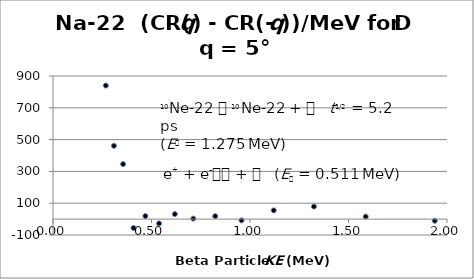
| Category | Series 0 |
|---|---|
| 0.2680227366322104 | 839.871 |
| 0.309304754344384 | 460.938 |
| 0.35590877077319627 | 345.836 |
| 0.4087613453094022 | -55.675 |
| 0.4690432505833301 | 18.925 |
| 0.5382797505768625 | -27.31 |
| 0.6184725682258746 | 31.31 |
| 0.7122978664250175 | 3.22 |
| 0.8234122552039224 | 18.587 |
| 0.9569424467790375 | -7.947 |
| 1.1203013982320613 | 54.708 |
| 1.3246166201445688 | 78.832 |
| 1.5873828179673266 | 15.888 |
| 1.937767254325585 | -10.507 |